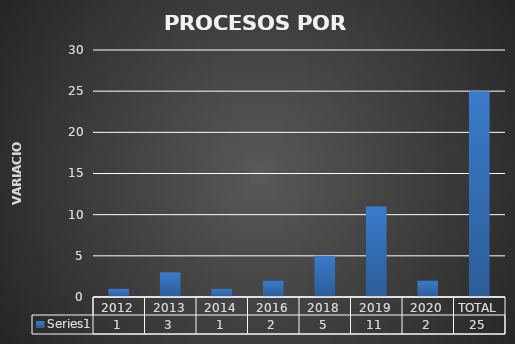
| Category | Series 0 |
|---|---|
| 2012 | 1 |
| 2013 | 3 |
| 2014 | 1 |
| 2016 | 2 |
| 2018 | 5 |
| 2019 | 11 |
| 2020 | 2 |
| TOTAL | 25 |